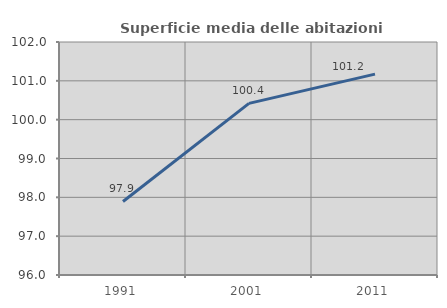
| Category | Superficie media delle abitazioni occupate |
|---|---|
| 1991.0 | 97.894 |
| 2001.0 | 100.42 |
| 2011.0 | 101.172 |